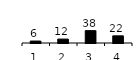
| Category | Series 0 |
|---|---|
| 1.0 | 6 |
| 2.0 | 12 |
| 3.0 | 38 |
| 4.0 | 22 |